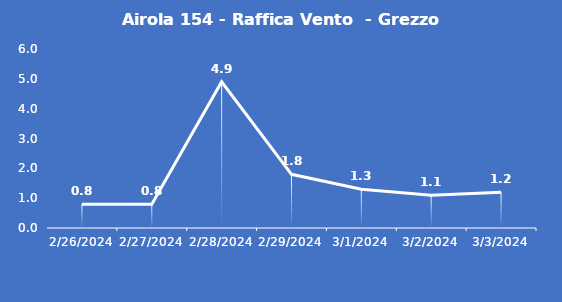
| Category | Airola 154 - Raffica Vento  - Grezzo (m/s) |
|---|---|
| 2/26/24 | 0.8 |
| 2/27/24 | 0.8 |
| 2/28/24 | 4.9 |
| 2/29/24 | 1.8 |
| 3/1/24 | 1.3 |
| 3/2/24 | 1.1 |
| 3/3/24 | 1.2 |